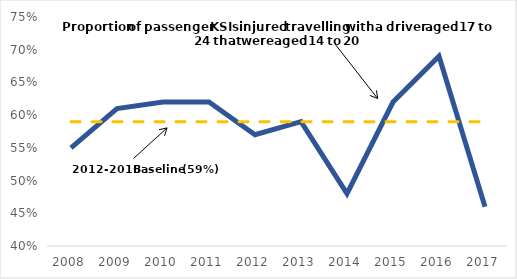
| Category | Series 0 | Series 1 |
|---|---|---|
| 2008.0 | 0.55 | 0.59 |
| 2009.0 | 0.61 | 0.59 |
| 2010.0 | 0.62 | 0.59 |
| 2011.0 | 0.62 | 0.59 |
| 2012.0 | 0.57 | 0.59 |
| 2013.0 | 0.59 | 0.59 |
| 2014.0 | 0.48 | 0.59 |
| 2015.0 | 0.62 | 0.59 |
| 2016.0 | 0.69 | 0.59 |
| 2017.0 | 0.46 | 0.59 |